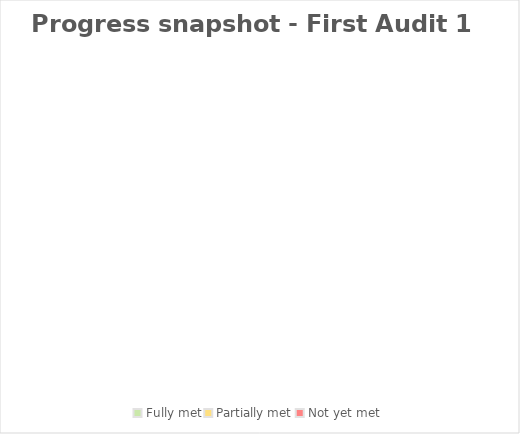
| Category | Term 1 |
|---|---|
| Fully met | 0 |
| Partially met | 0 |
| Not yet met | 0 |